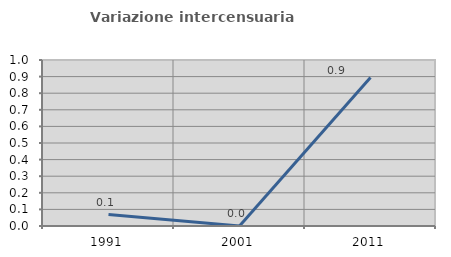
| Category | Variazione intercensuaria annua |
|---|---|
| 1991.0 | 0.069 |
| 2001.0 | 0 |
| 2011.0 | 0.894 |